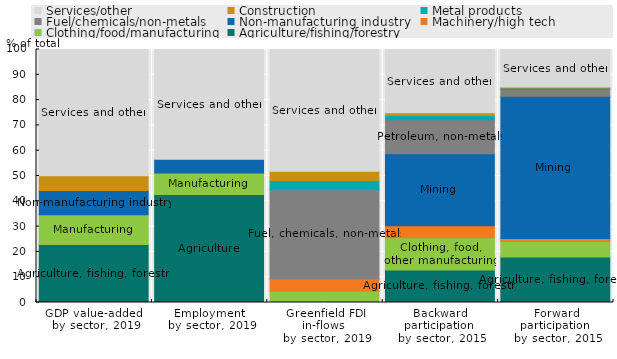
| Category | Agriculture/fishing/forestry | Clothing/food/manufacturing | Machinery/high tech | Non-manufacturing industry | Fuel/chemicals/non-metals | Metal products | Construction | Services/other |
|---|---|---|---|---|---|---|---|---|
| GDP value-added 
by sector, 2019 | 22.899 | 11.782 | 0 | 9.618 | 0 | 0 | 5.752 | 49.949 |
| Employment 
by sector, 2019 | 42.685 | 8.481 | 0 | 5.422 | 0 | 0 | 0 | 43.412 |
| Greenfield FDI in-flows 
by sector, 2019 | 0 | 4.401 | 4.842 | 0 | 35.346 | 3.519 | 3.747 | 48.147 |
| Backward participation 
by sector, 2015 | 12.812 | 12.827 | 4.746 | 28.451 | 13.442 | 1.641 | 1.074 | 25.008 |
| Forward participation 
by sector, 2015 | 17.98 | 6.145 | 1.156 | 56.252 | 2.716 | 0.517 | 0.408 | 14.826 |